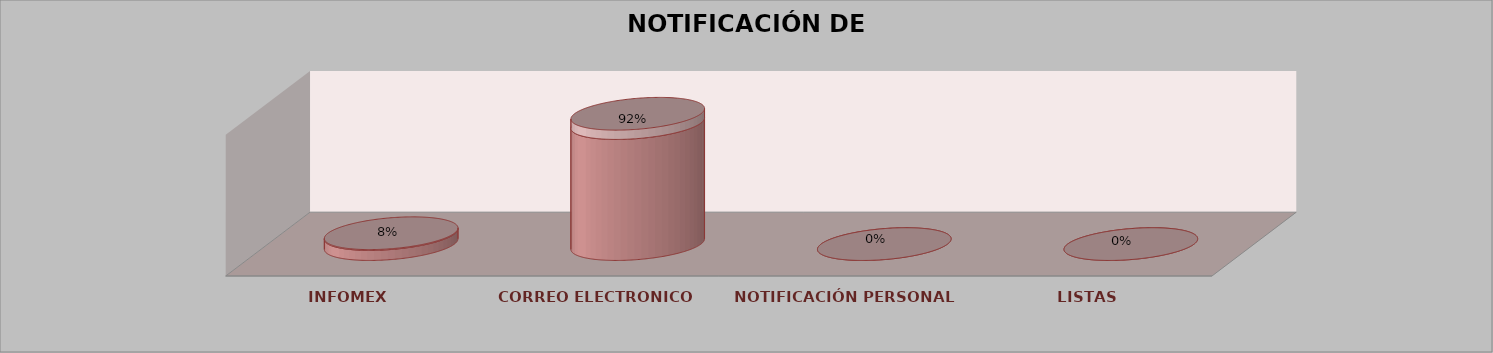
| Category | Series 0 | Series 1 | Series 2 | Series 3 | Series 4 |
|---|---|---|---|---|---|
| INFOMEX |  |  |  | 1 | 0.077 |
| CORREO ELECTRONICO |  |  |  | 12 | 0.923 |
| NOTIFICACIÓN PERSONAL |  |  |  | 0 | 0 |
| LISTAS |  |  |  | 0 | 0 |